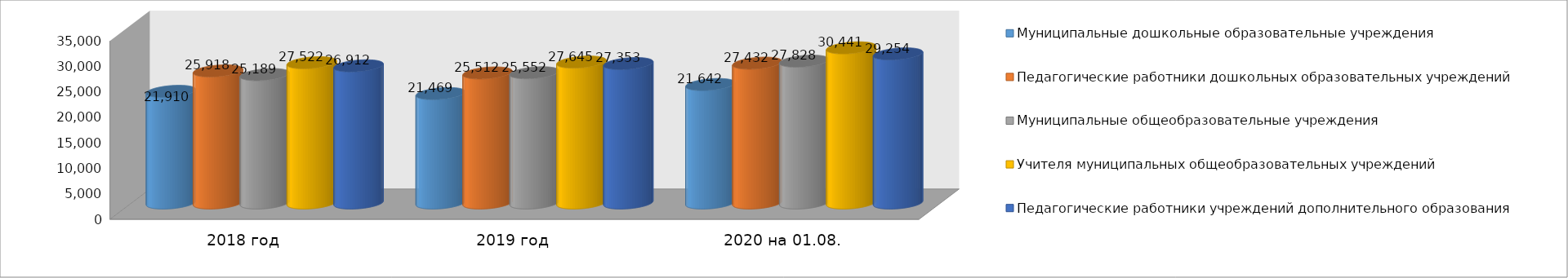
| Category | Муниципальные дошкольные образовательные учреждения | Педагогические работники дошкольных образовательных учреждений | Муниципальные общеобразовательные учреждения | Учителя муниципальных общеобразовательных учреждений | Педагогические работники учреждений дополнительного образования |
|---|---|---|---|---|---|
| 2018 год | 21910 | 25918 | 25189 | 27522 | 26912 |
| 2019 год | 21469 | 25512 | 25552 | 27645 | 27353 |
| 2020 на 01.08. | 23242 | 27432 | 27828 | 30441 | 29254 |